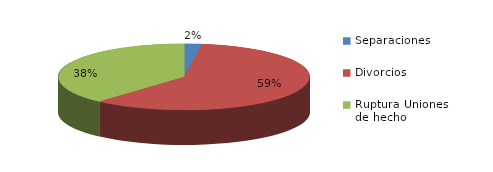
| Category | Series 0 |
|---|---|
| Separaciones | 214 |
| Divorcios | 5586 |
| Ruptura Uniones de hecho | 3609 |